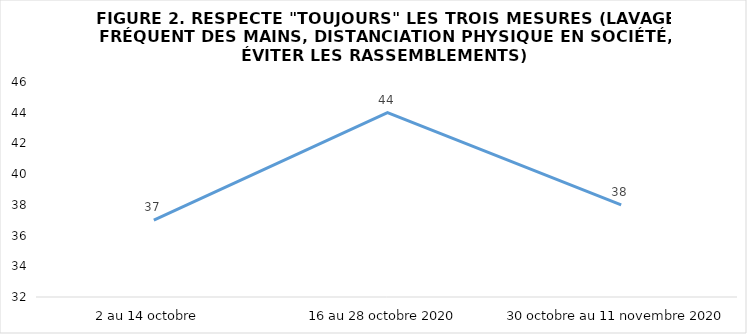
| Category | Series 0 |
|---|---|
| 2 au 14 octobre  | 37 |
| 16 au 28 octobre 2020 | 44 |
| 30 octobre au 11 novembre 2020 | 38 |